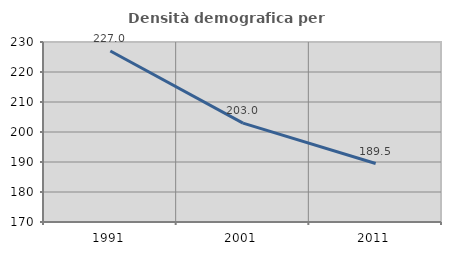
| Category | Densità demografica |
|---|---|
| 1991.0 | 226.996 |
| 2001.0 | 202.955 |
| 2011.0 | 189.488 |